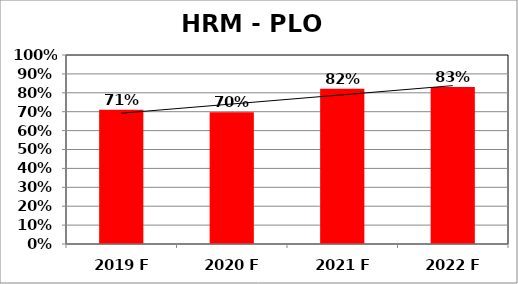
| Category | Series 0 |
|---|---|
| 2019 F | 0.71 |
| 2020 F | 0.697 |
| 2021 F | 0.822 |
| 2022 F | 0.831 |